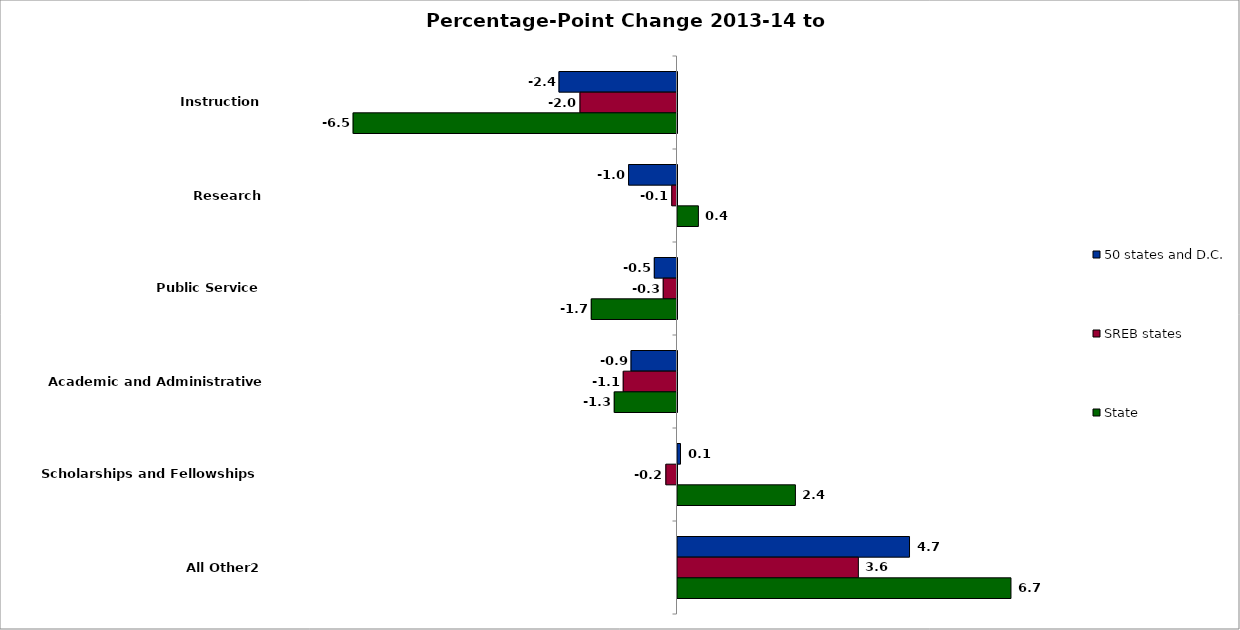
| Category | 50 states and D.C. | SREB states | State |
|---|---|---|---|
| Instruction | -2.381 | -1.957 | -6.534 |
| Research | -0.976 | -0.105 | 0.422 |
| Public Service | -0.457 | -0.278 | -1.729 |
| Academic and Administrative Support3 | -0.927 | -1.085 | -1.266 |
| Scholarships and Fellowships | 0.061 | -0.225 | 2.379 |
| All Other2 | 4.681 | 3.649 | 6.729 |